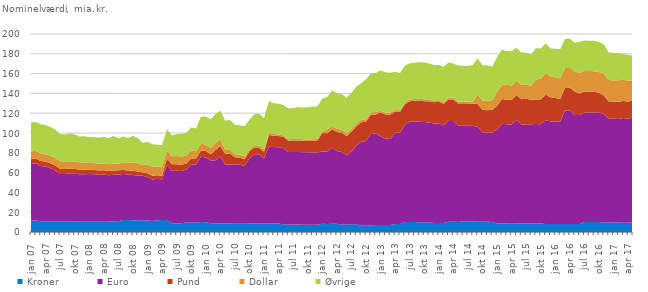
| Category | Kroner | Euro | Pund | Dollar | Øvrige |
|---|---|---|---|---|---|
| jan 07 | 11.5 | 57.179 | 5.058 | 7.834 | 29.088 |
| feb 07 | 11.5 | 57.64 | 4.978 | 7.679 | 29.211 |
| mar 07 | 10.836 | 55.867 | 4.932 | 7.615 | 29.58 |
| apr 07 | 10.886 | 55.332 | 4.911 | 7.454 | 29.413 |
| maj 07 | 10.911 | 53.569 | 4.929 | 7.488 | 29.24 |
| jun 07 | 10.886 | 51.302 | 4.96 | 7.507 | 28.917 |
| jul 07 | 10.906 | 47.64 | 4.968 | 7.884 | 27.65 |
| aug 07 | 10.931 | 47.762 | 4.944 | 7.894 | 26.837 |
| sep 07 | 10.931 | 48.184 | 4.814 | 7.636 | 28.133 |
| okt 07 | 10.931 | 47.993 | 4.811 | 7.494 | 27.308 |
| nov 07 | 10.434 | 48.002 | 4.696 | 7.338 | 26.094 |
| dec 07 | 10.284 | 48.02 | 4.567 | 7.371 | 26.351 |
| jan 08 | 10.453 | 48.212 | 4.485 | 7.28 | 25.536 |
| feb 08 | 10.453 | 47.826 | 4.382 | 7.136 | 25.856 |
| mar 08 | 10.453 | 47.439 | 4.217 | 6.81 | 26.535 |
| apr 08 | 10.453 | 47.686 | 4.25 | 6.934 | 26.613 |
| maj 08 | 10.453 | 46.932 | 4.27 | 6.903 | 26.483 |
| jun 08 | 10.803 | 47.059 | 4.236 | 6.79 | 28.024 |
| jul 08 | 10.803 | 47.225 | 4.256 | 6.787 | 25.646 |
| aug 08 | 12.016 | 46.563 | 4.169 | 7.188 | 26.48 |
| sep 08 | 12.016 | 45.957 | 4.248 | 7.408 | 25.426 |
| okt 08 | 11.884 | 45.663 | 4.258 | 8.289 | 26.884 |
| nov 08 | 11.884 | 45.278 | 4.041 | 8.314 | 25.47 |
| dec 08 | 11.831 | 44.909 | 3.442 | 7.505 | 22.248 |
| jan 09 | 11.664 | 43.969 | 3.735 | 8.84 | 22.877 |
| feb 09 | 11.164 | 41.937 | 3.754 | 8.957 | 22.938 |
| mar 09 | 11.9 | 41.791 | 3.601 | 8.507 | 22.252 |
| apr 09 | 12.114 | 40.93 | 3.752 | 8.529 | 22.562 |
| maj 09 | 12.164 | 55.637 | 6.397 | 8.028 | 21.447 |
| jun 09 | 8.614 | 53.321 | 6.555 | 8.009 | 20.886 |
| jul 09 | 8.614 | 53.334 | 6.527 | 8.401 | 22.216 |
| aug 09 | 8.614 | 53.065 | 6.334 | 8.318 | 22.685 |
| sep 09 | 10.057 | 53.091 | 6.14 | 8.046 | 23.023 |
| okt 09 | 9.455 | 58.601 | 6.246 | 7.96 | 23.339 |
| nov 09 | 9.735 | 58.522 | 6.123 | 7.097 | 23.069 |
| dec 09 | 10.083 | 65.975 | 6.174 | 6.916 | 27.26 |
| jan 10 | 9.938 | 65.425 | 6.443 | 6.57 | 28.311 |
| feb 10 | 8.933 | 63.271 | 6.253 | 6.76 | 28.73 |
| mar 10 | 8.936 | 63.453 | 10.458 | 6.807 | 29.409 |
| apr 10 | 8.601 | 67.64 | 10.719 | 6.919 | 28.919 |
| maj 10 | 8.601 | 59.578 | 10.958 | 3.763 | 29.608 |
| jun 10 | 8.567 | 59.411 | 11.39 | 3.779 | 29.859 |
| jul 10 | 8.283 | 60.121 | 7.14 | 3.016 | 29.713 |
| aug 10 | 8.281 | 59.595 | 7.221 | 3.038 | 29.804 |
| sep 10 | 8.241 | 58.385 | 6.932 | 2.826 | 30.477 |
| okt 10 | 8.667 | 65.912 | 6.867 | 2.166 | 29.686 |
| nov 10 | 8.642 | 69.445 | 7.118 | 2.308 | 31.349 |
| dec 10 | 8.729 | 69.295 | 6.933 | 2.259 | 32.334 |
| jan 11 | 8.723 | 65.508 | 6.927 | 2.191 | 31.855 |
| feb 11 | 8.723 | 77.456 | 11.804 | 2.169 | 32.257 |
| mar 11 | 8.535 | 77.198 | 11.391 | 2.113 | 30.761 |
| apr 11 | 8.493 | 77.208 | 11.291 | 1.518 | 30.932 |
| maj 11 | 7.493 | 77.192 | 11.543 | 1.568 | 30.52 |
| jun 11 | 7.663 | 73.259 | 11.156 | 1.561 | 31.075 |
| jul 11 | 7.663 | 73.226 | 11.495 | 1.58 | 31.272 |
| aug 11 | 7.549 | 73.243 | 11.358 | 2.075 | 31.93 |
| sep 11 | 7.379 | 73.15 | 11.592 | 1.598 | 31.731 |
| okt 11 | 7.35 | 73.153 | 11.507 | 1.541 | 32.382 |
| nov 11 | 7.325 | 73.104 | 11.732 | 1.607 | 32.655 |
| dec 11 | 7.221 | 73.076 | 12.015 | 1.666 | 32.96 |
| jan 12 | 8.219 | 73.162 | 18.695 | 1.636 | 33.261 |
| feb 12 | 8.095 | 73.172 | 18.503 | 3.404 | 33.239 |
| mar 12 | 8.246 | 76.894 | 18.736 | 3.431 | 35.591 |
| apr 12 | 8.246 | 73.48 | 19.216 | 3.467 | 35.839 |
| maj 12 | 7.276 | 73.412 | 19.511 | 3.088 | 36.213 |
| jun 12 | 7.719 | 69.71 | 19.348 | 3.043 | 35.869 |
| jul 12 | 7.719 | 73.581 | 19.932 | 2.668 | 36.741 |
| aug 12 | 7.719 | 79.274 | 19.677 | 2.602 | 37.711 |
| sep 12 | 6.246 | 84.911 | 19.618 | 2.539 | 37.045 |
| okt 12 | 6.996 | 84.96 | 19.425 | 2.529 | 40.257 |
| nov 12 | 6.648 | 92.422 | 19.322 | 2.53 | 39.297 |
| dec 12 | 7.083 | 92.427 | 19.177 | 2.492 | 39.308 |
| jan 13 | 7.183 | 89.163 | 24.378 | 1.875 | 40.816 |
| feb 13 | 7.161 | 87.236 | 24.191 | 1.936 | 40.883 |
| mar 13 | 7.054 | 86.906 | 24.691 | 1.99 | 40.117 |
| apr 13 | 8.054 | 92.162 | 21.194 | 1.939 | 38.633 |
| maj 13 | 8.125 | 92.047 | 20.961 | 1.949 | 37.504 |
| jun 13 | 10.125 | 97.981 | 20.883 | 1.939 | 37.116 |
| jul 13 | 10.125 | 101.442 | 20.482 | 1.909 | 36.538 |
| aug 13 | 10.125 | 101.382 | 20.964 | 1.916 | 36.573 |
| sep 13 | 9.96 | 101.364 | 21.409 | 1.878 | 37.032 |
| okt 13 | 9.96 | 101.157 | 21.055 | 1.859 | 37.078 |
| nov 13 | 9.539 | 101.159 | 21.497 | 1.863 | 36.027 |
| dec 13 | 9.051 | 100.656 | 21.407 | 1.84 | 35.652 |
| jan 14 | 8.991 | 100.68 | 21.804 | 1.794 | 35.444 |
| feb 14 | 8.975 | 98.823 | 21.676 | 1.756 | 35.749 |
| mar 14 | 10.427 | 101.706 | 21.635 | 1.76 | 35.613 |
| apr 14 | 10.427 | 101.681 | 21.766 | 1.751 | 34.554 |
| maj 14 | 9.977 | 97.715 | 22.045 | 1.782 | 36.625 |
| jun 14 | 10.753 | 97.016 | 22.325 | 1.776 | 36.185 |
| jul 14 | 10.753 | 96.548 | 22.572 | 1.813 | 36.028 |
| aug 14 | 10.752 | 96.491 | 22.488 | 1.838 | 37.066 |
| sep 14 | 10.309 | 95.907 | 22.981 | 9.319 | 37.036 |
| okt 14 | 10.315 | 90.35 | 22.782 | 9.364 | 35.524 |
| nov 14 | 10.314 | 90.307 | 22.455 | 9.39 | 35.922 |
| dec 14 | 10.019 | 90.556 | 22.836 | 9.643 | 33.746 |
| jan 15 | 8.515 | 94.89 | 24.014 | 14.368 | 34.915 |
| feb 15 | 8.515 | 100.945 | 24.856 | 14.493 | 35.54 |
| mar 15 | 8.515 | 100.281 | 24.885 | 15.149 | 34.101 |
| apr 15 | 8.319 | 100.177 | 24.884 | 14.52 | 34.627 |
| maj 15 | 8.519 | 104.63 | 25.139 | 14.838 | 32.911 |
| jun 15 | 8.519 | 100.165 | 25.41 | 14.549 | 32.709 |
| jul 15 | 8.619 | 100.18 | 25.677 | 14.845 | 32.042 |
| aug 15 | 8.619 | 100.198 | 24.855 | 13.854 | 31.493 |
| sep 15 | 8.758 | 100.333 | 24.475 | 20.522 | 31.495 |
| okt 15 | 8.538 | 100.306 | 25.16 | 20.863 | 30.473 |
| nov 15 | 8.054 | 104.816 | 25.648 | 21.735 | 30.087 |
| dec 15 | 8.026 | 103.551 | 24.501 | 21.05 | 28.359 |
| jan 16 | 8.062 | 103.55 | 23.665 | 21.063 | 28.815 |
| feb 16 | 8.082 | 103.224 | 23.003 | 21.117 | 29.441 |
| mar 16 | 8.067 | 114.561 | 22.809 | 20.171 | 29.402 |
| apr 16 | 8.038 | 114.452 | 23.117 | 20.12 | 29.454 |
| maj 16 | 8.016 | 110.155 | 23.655 | 20.551 | 28.691 |
| jun 16 | 8.009 | 110.178 | 21.795 | 20.649 | 31.559 |
| jul 16 | 10.097 | 110.454 | 21.37 | 20.626 | 30.839 |
| aug 16 | 10.097 | 110.545 | 21.267 | 20.603 | 30.794 |
| sep 16 | 10.057 | 110.661 | 20.958 | 20.577 | 30.926 |
| okt 16 | 10.049 | 110.477 | 20.025 | 20.949 | 30.446 |
| nov 16 | 9.505 | 109.886 | 18.535 | 21.559 | 30.238 |
| dec 16 | 9.505 | 104.915 | 17.368 | 21.744 | 27.738 |
| jan 17 | 9.537 | 104.956 | 17.255 | 21.323 | 27.968 |
| feb 17 | 9.537 | 104.601 | 17.412 | 21.638 | 27.657 |
| mar 17 | 9.233 | 105.823 | 17.364 | 21.457 | 25.921 |
| apr 17 | 9.389 | 104.946 | 17.587 | 20.966 | 25.865 |
| maj 17 | 9.737 | 105.991 | 17.005 | 20.434 | 25.136 |